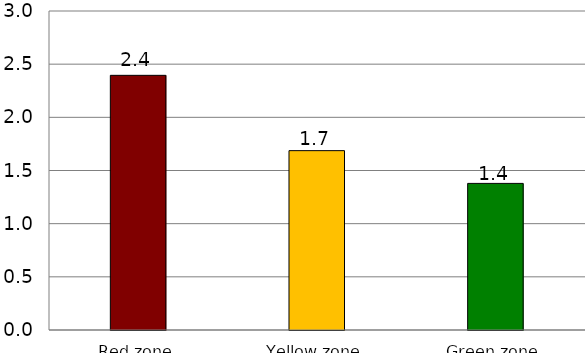
| Category | Series 2 |
|---|---|
| Red zone | 2.395 |
| Yellow zone | 1.687 |
| Green zone | 1.379 |